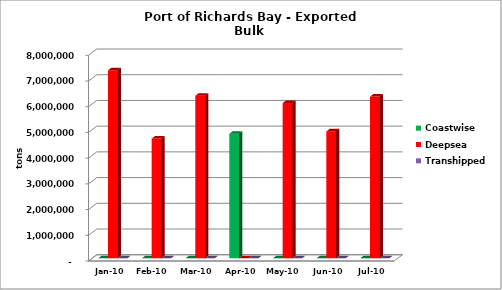
| Category | Coastwise | Deepsea | Series 2 | Transhipped |
|---|---|---|---|---|
| 2010-01-01 | 0 | 7308192 |  | 0 |
| 2010-02-01 | 0 | 4653869 |  | 0 |
| 2010-03-01 | 0 | 6320739 |  | 0 |
| 2010-04-01 | 4840556 | 0 |  | 0 |
| 2010-05-01 | 0 | 6035192 |  | 0 |
| 2010-06-01 | 0 | 4934182 |  | 0 |
| 2010-07-01 | 0 | 6285461 |  | 0 |